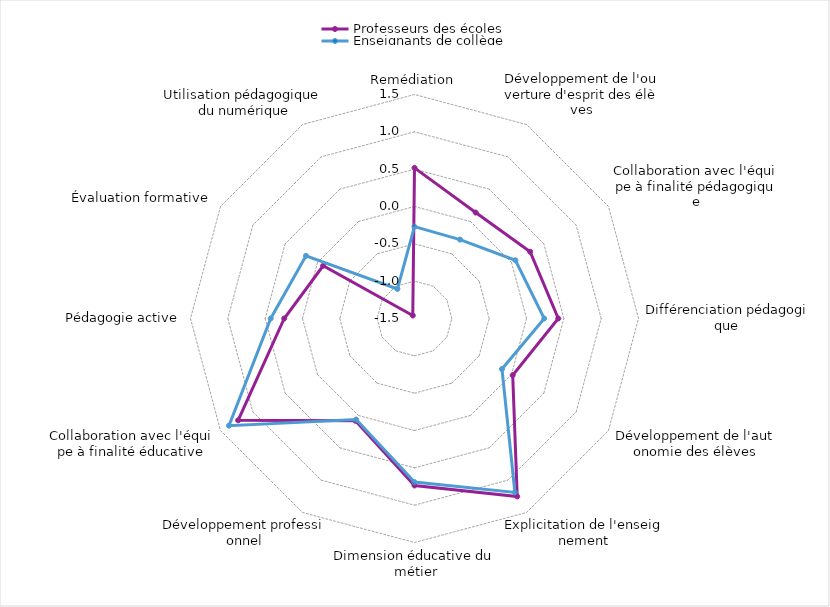
| Category | Professeurs des écoles | Enseignants de collège |
|---|---|---|
| Remédiation | 0.518 | -0.269 |
| Développement de l'ouverture d'esprit des élèves | 0.139 | -0.28 |
| Collaboration avec l'équipe à finalité pédagogique | 0.288 | 0.06 |
| Différenciation pédagogique | 0.426 | 0.238 |
| Développement de l'autonomie des élèves | 0.019 | -0.147 |
| Explicitation de l'enseignement | 1.252 | 1.189 |
| Dimension éducative du métier | 0.737 | 0.691 |
| Développement professionnel | 0.082 | 0.063 |
| Collaboration avec l'équipe à finalité éducative | 1.227 | 1.369 |
| Pédagogie active | 0.245 | 0.426 |
| Évaluation formative | -0.087 | 0.178 |
| Utilisation pédagogique du numérique | -1.454 | -1.043 |